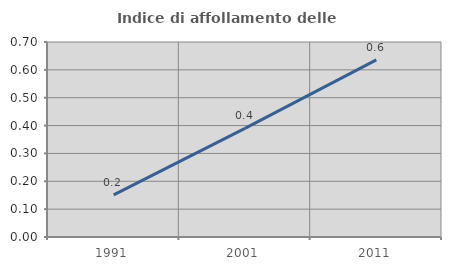
| Category | Indice di affollamento delle abitazioni  |
|---|---|
| 1991.0 | 0.152 |
| 2001.0 | 0.39 |
| 2011.0 | 0.636 |